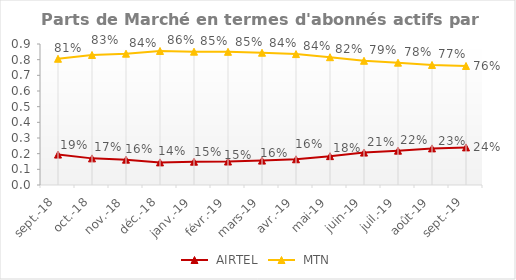
| Category | Series 13 | Series 14 |
|---|---|---|
| sept.-18 | 0.194 | 0.806 |
| oct.-18 | 0.17 | 0.83 |
| nov.-18 | 0.162 | 0.838 |
| déc.-18 | 0.144 | 0.856 |
| janv.-19 | 0.149 | 0.851 |
| févr.-19 | 0.15 | 0.85 |
| mars-19 | 0.156 | 0.844 |
| avr.-19 | 0.164 | 0.836 |
| mai-19 | 0.184 | 0.816 |
| juin-19 | 0.207 | 0.793 |
| juil.-19 | 0.219 | 0.781 |
| août-19 | 0.234 | 0.766 |
| sept.-19 | 0.24 | 0.76 |